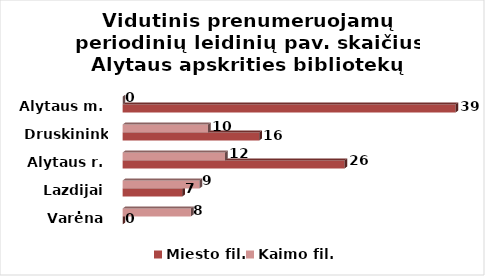
| Category | Miesto fil. | Kaimo fil. |
|---|---|---|
| Varėna | 0 | 8 |
| Lazdijai | 7 | 9 |
| Alytaus r. | 26 | 12 |
| Druskininkai | 16 | 10 |
| Alytaus m. | 39 | 0 |